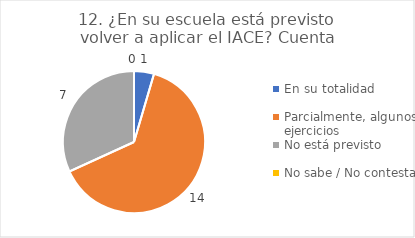
| Category | 12. ¿En su escuela está previsto volver a aplicar el IACE? |
|---|---|
| En su totalidad  | 0.045 |
| Parcialmente, algunos ejercicios  | 0.636 |
| No está previsto  | 0.318 |
| No sabe / No contesta | 0 |